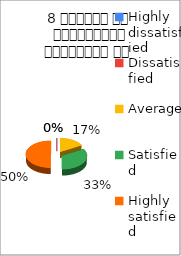
| Category | 8 शिक्षक का सम्प्रेषण सुस्पष्ठ है  |
|---|---|
| Highly dissatisfied | 0 |
| Dissatisfied | 0 |
| Average | 1 |
| Satisfied | 2 |
| Highly satisfied | 3 |